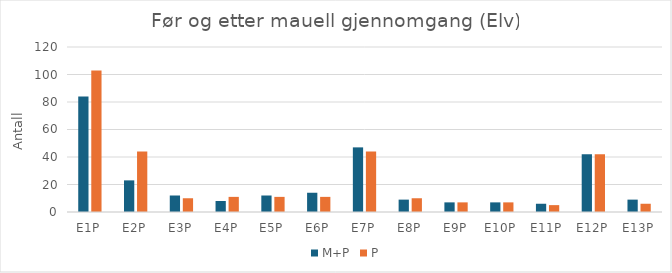
| Category | M+P | P |
|---|---|---|
| E1P | 84 | 103 |
| E2P | 23 | 44 |
| E3P | 12 | 10 |
| E4P | 8 | 11 |
| E5P | 12 | 11 |
| E6P | 14 | 11 |
| E7P | 47 | 44 |
| E8P | 9 | 10 |
| E9P | 7 | 7 |
| E10P | 7 | 7 |
| E11P | 6 | 5 |
| E12P | 42 | 42 |
| E13P | 9 | 6 |